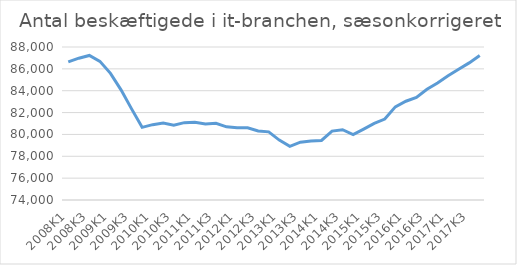
| Category | Series 0 |
|---|---|
| 2008K1 | 86636.24 |
| 2008K2 | 86975.37 |
| 2008K3 | 87226.685 |
| 2008K4 | 86684.503 |
| 2009K1 | 85590.395 |
| 2009K2 | 84076.646 |
| 2009K3 | 82336.83 |
| 2009K4 | 80649.546 |
| 2010K1 | 80895.503 |
| 2010K2 | 81041.129 |
| 2010K3 | 80844.09 |
| 2010K4 | 81078.99 |
| 2011K1 | 81110.777 |
| 2011K2 | 80961.016 |
| 2011K3 | 81014.744 |
| 2011K4 | 80697.524 |
| 2012K1 | 80607.231 |
| 2012K2 | 80615.531 |
| 2012K3 | 80319.496 |
| 2012K4 | 80233.162 |
| 2013K1 | 79480.415 |
| 2013K2 | 78903.86 |
| 2013K3 | 79293.21 |
| 2013K4 | 79406.403 |
| 2014K1 | 79449.036 |
| 2014K2 | 80305.872 |
| 2014K3 | 80427.077 |
| 2014K4 | 79983.57 |
| 2015K1 | 80491.278 |
| 2015K2 | 81011.991 |
| 2015K3 | 81407.785 |
| 2015K4 | 82520.886 |
| 2016K1 | 83038.811 |
| 2016K2 | 83380.785 |
| 2016K3 | 84126.959 |
| 2016K4 | 84712.802 |
| 2017K1 | 85367.241 |
| 2017K2 | 85964.972 |
| 2017K3 | 86545.895 |
| 2017K4 | 87218.569 |